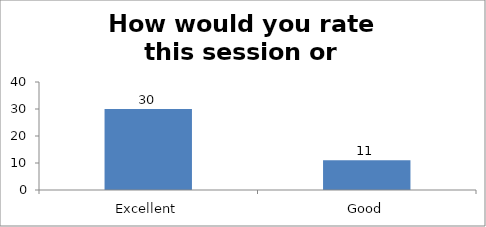
| Category | How would you rate this session or workshop? |
|---|---|
| Excellent | 30 |
| Good | 11 |